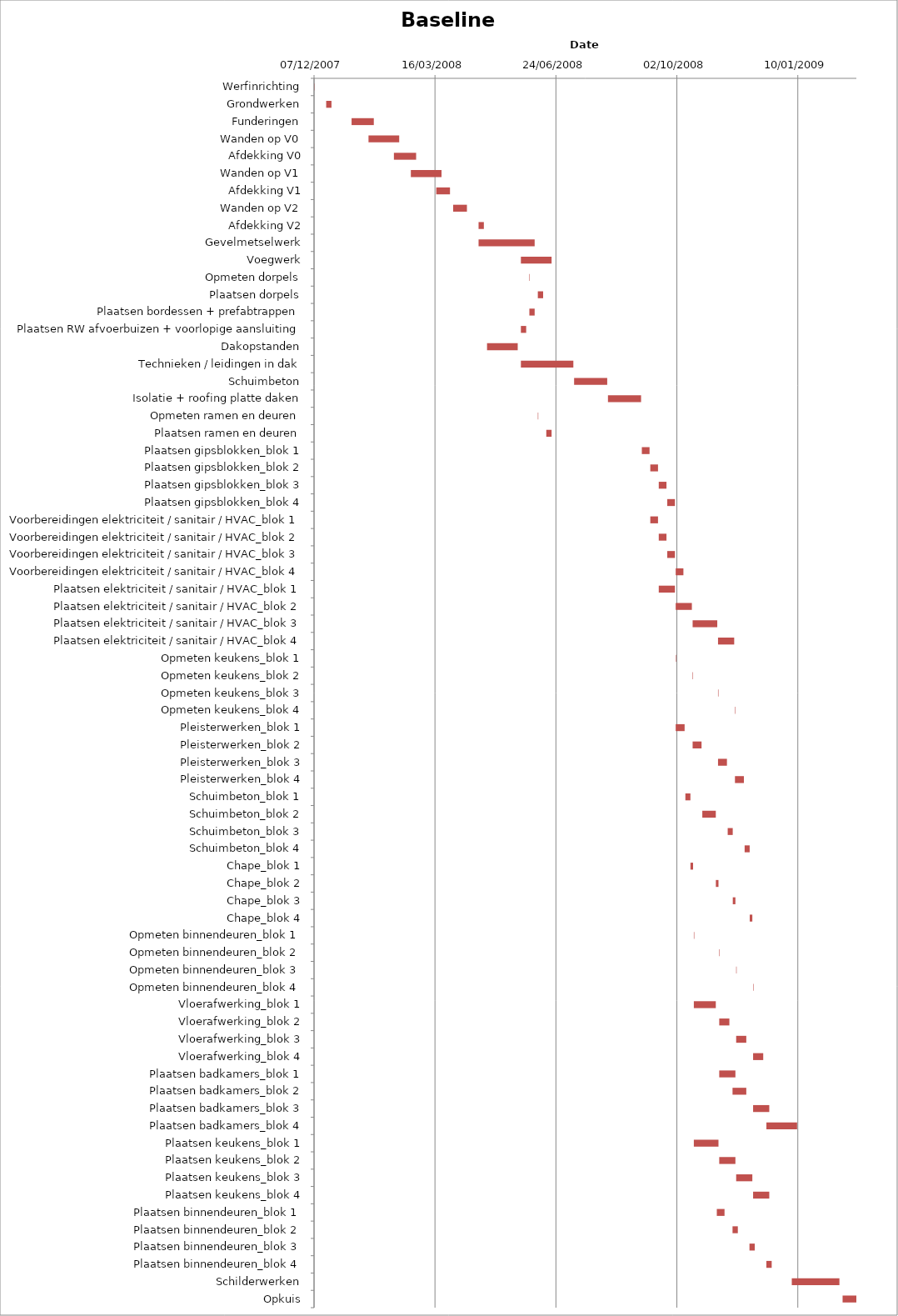
| Category | Baseline start | Actual duration |
|---|---|---|
| Werfinrichting | 39423.333 | 0.375 |
| Grondwerken | 39433.333 | 4.375 |
| Funderingen | 39454.333 | 18.375 |
| Wanden op V0 | 39468.333 | 25.375 |
| Afdekking V0 | 39489.333 | 18.375 |
| Wanden op V1 | 39503.333 | 25.375 |
| Afdekking V1 | 39524.333 | 11.375 |
| Wanden op V2 | 39538.333 | 11.375 |
| Afdekking V2 | 39559.333 | 4.375 |
| Gevelmetselwerk | 39559.333 | 46.375 |
| Voegwerk | 39594.333 | 25.375 |
| Opmeten dorpels | 39601.333 | 0.375 |
| Plaatsen dorpels | 39608.333 | 4.375 |
| Plaatsen bordessen + prefabtrappen | 39601.333 | 4.375 |
| Plaatsen RW afvoerbuizen + voorlopige aansluiting | 39594.333 | 4.375 |
| Dakopstanden | 39566.333 | 25.375 |
| Technieken / leidingen in dak | 39594.333 | 43.375 |
| Schuimbeton | 39638.333 | 27.375 |
| Isolatie + roofing platte daken | 39666.333 | 27.375 |
| Opmeten ramen en deuren | 39608.333 | 0.375 |
| Plaatsen ramen en deuren | 39615.333 | 4.375 |
| Plaatsen gipsblokken_blok 1 | 39694.333 | 6.375 |
| Plaatsen gipsblokken_blok 2 | 39701.333 | 6.375 |
| Plaatsen gipsblokken_blok 3 | 39708.333 | 6.375 |
| Plaatsen gipsblokken_blok 4 | 39715.333 | 6.375 |
| Voorbereidingen elektriciteit / sanitair / HVAC_blok 1 | 39701.333 | 6.375 |
| Voorbereidingen elektriciteit / sanitair / HVAC_blok 2 | 39708.333 | 6.375 |
| Voorbereidingen elektriciteit / sanitair / HVAC_blok 3 | 39715.333 | 6.375 |
| Voorbereidingen elektriciteit / sanitair / HVAC_blok 4 | 39722.333 | 6.375 |
| Plaatsen elektriciteit / sanitair / HVAC_blok 1 | 39708.333 | 13.375 |
| Plaatsen elektriciteit / sanitair / HVAC_blok 2 | 39722.333 | 13.375 |
| Plaatsen elektriciteit / sanitair / HVAC_blok 3 | 39736.333 | 20.375 |
| Plaatsen elektriciteit / sanitair / HVAC_blok 4 | 39757.333 | 13.375 |
| Opmeten keukens_blok 1 | 39722.333 | 0.375 |
| Opmeten keukens_blok 2 | 39736.333 | 0.375 |
| Opmeten keukens_blok 3 | 39757.333 | 0.375 |
| Opmeten keukens_blok 4 | 39771.333 | 0.375 |
| Pleisterwerken_blok 1 | 39722.333 | 7.375 |
| Pleisterwerken_blok 2 | 39736.333 | 7.375 |
| Pleisterwerken_blok 3 | 39757.333 | 7.375 |
| Pleisterwerken_blok 4 | 39771.333 | 7.375 |
| Schuimbeton_blok 1 | 39730.333 | 4.167 |
| Schuimbeton_blok 2 | 39744.333 | 11.167 |
| Schuimbeton_blok 3 | 39765.333 | 4.167 |
| Schuimbeton_blok 4 | 39779.333 | 4.167 |
| Chape_blok 1 | 39734.542 | 2.167 |
| Chape_blok 2 | 39755.542 | 2.167 |
| Chape_blok 3 | 39769.542 | 2.167 |
| Chape_blok 4 | 39783.542 | 2.167 |
| Opmeten binnendeuren_blok 1 | 39737.333 | 0.375 |
| Opmeten binnendeuren_blok 2 | 39758.333 | 0.375 |
| Opmeten binnendeuren_blok 3 | 39772.333 | 0.375 |
| Opmeten binnendeuren_blok 4 | 39786.333 | 0.375 |
| Vloerafwerking_blok 1 | 39737.333 | 18.167 |
| Vloerafwerking_blok 2 | 39758.333 | 8.375 |
| Vloerafwerking_blok 3 | 39772.333 | 8.375 |
| Vloerafwerking_blok 4 | 39786.333 | 8.375 |
| Plaatsen badkamers_blok 1 | 39758.333 | 13.375 |
| Plaatsen badkamers_blok 2 | 39769.333 | 11.375 |
| Plaatsen badkamers_blok 3 | 39786.333 | 13.375 |
| Plaatsen badkamers_blok 4 | 39797.333 | 25.375 |
| Plaatsen keukens_blok 1 | 39737.333 | 20.375 |
| Plaatsen keukens_blok 2 | 39758.333 | 13.375 |
| Plaatsen keukens_blok 3 | 39772.333 | 13.375 |
| Plaatsen keukens_blok 4 | 39786.333 | 13.375 |
| Plaatsen binnendeuren_blok 1 | 39756.333 | 6.375 |
| Plaatsen binnendeuren_blok 2 | 39769.333 | 4.375 |
| Plaatsen binnendeuren_blok 3 | 39783.333 | 4.375 |
| Plaatsen binnendeuren_blok 4 | 39797.333 | 4.375 |
| Schilderwerken | 39818.333 | 39.375 |
| Opkuis | 39860.333 | 11.375 |